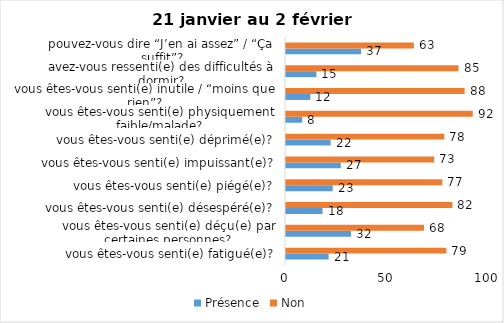
| Category | Présence | Non |
|---|---|---|
| vous êtes-vous senti(e) fatigué(e)? | 21 | 79 |
| vous êtes-vous senti(e) déçu(e) par certaines personnes? | 32 | 68 |
| vous êtes-vous senti(e) désespéré(e)? | 18 | 82 |
| vous êtes-vous senti(e) piégé(e)? | 23 | 77 |
| vous êtes-vous senti(e) impuissant(e)? | 27 | 73 |
| vous êtes-vous senti(e) déprimé(e)? | 22 | 78 |
| vous êtes-vous senti(e) physiquement faible/malade? | 8 | 92 |
| vous êtes-vous senti(e) inutile / “moins que rien”? | 12 | 88 |
| avez-vous ressenti(e) des difficultés à dormir? | 15 | 85 |
| pouvez-vous dire “J’en ai assez” / “Ça suffit”? | 37 | 63 |